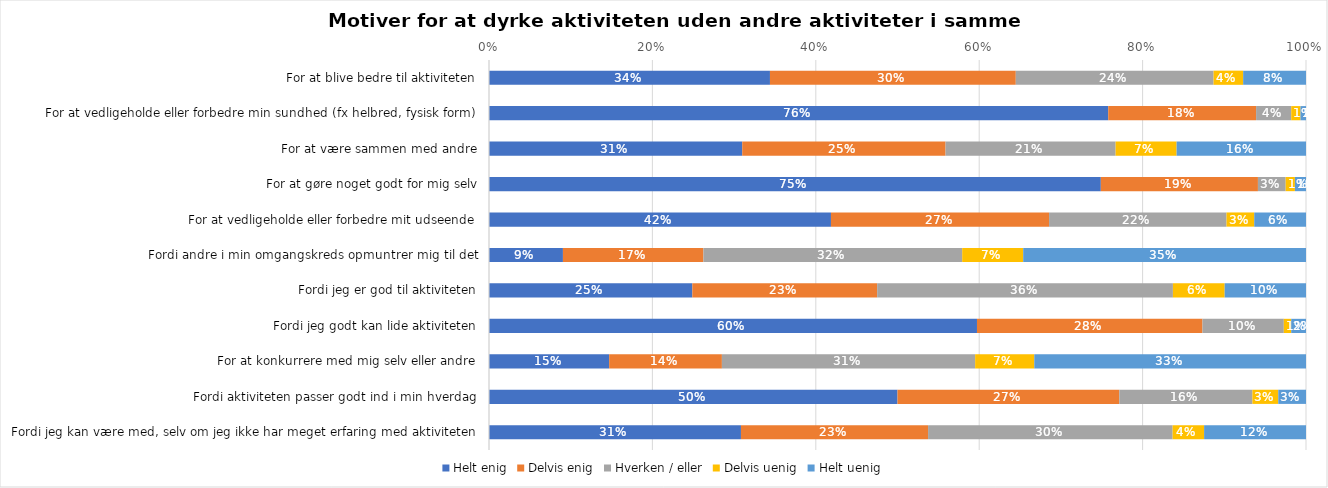
| Category | Helt enig | Delvis enig | Hverken / eller | Delvis uenig | Helt uenig |
|---|---|---|---|---|---|
| For at blive bedre til aktiviteten | 0.344 | 0.301 | 0.242 | 0.036 | 0.077 |
| For at vedligeholde eller forbedre min sundhed (fx helbred, fysisk form) | 0.758 | 0.181 | 0.043 | 0.011 | 0.007 |
| For at være sammen med andre | 0.31 | 0.249 | 0.208 | 0.075 | 0.158 |
| For at gøre noget godt for mig selv | 0.749 | 0.192 | 0.034 | 0.011 | 0.014 |
| For at vedligeholde eller forbedre mit udseende | 0.419 | 0.267 | 0.217 | 0.034 | 0.063 |
| Fordi andre i min omgangskreds opmuntrer mig til det | 0.09 | 0.172 | 0.317 | 0.075 | 0.346 |
| Fordi jeg er god til aktiviteten | 0.249 | 0.226 | 0.362 | 0.063 | 0.1 |
| Fordi jeg godt kan lide aktiviteten | 0.597 | 0.276 | 0.1 | 0.009 | 0.018 |
| For at konkurrere med mig selv eller andre | 0.147 | 0.138 | 0.31 | 0.072 | 0.333 |
| Fordi aktiviteten passer godt ind i min hverdag | 0.5 | 0.271 | 0.163 | 0.032 | 0.034 |
| Fordi jeg kan være med, selv om jeg ikke har meget erfaring med aktiviteten | 0.308 | 0.229 | 0.299 | 0.039 | 0.125 |